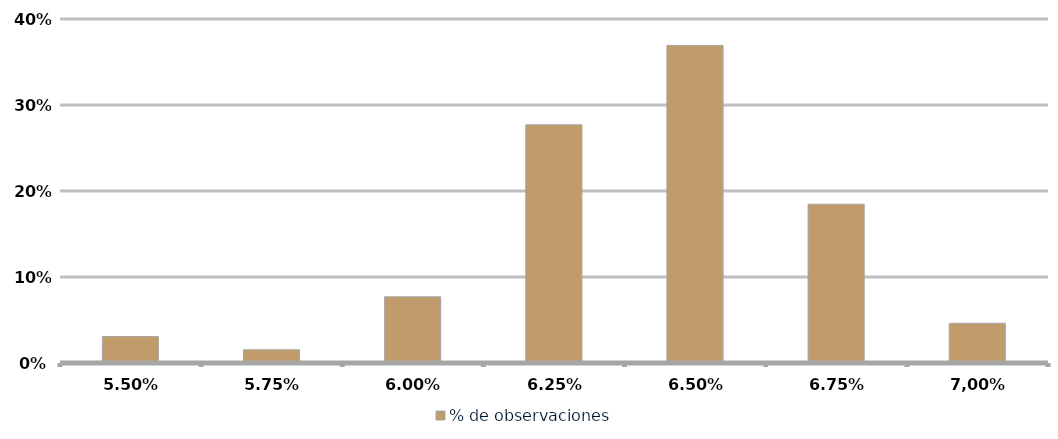
| Category | % de observaciones  |
|---|---|
| 5,50% | 0.031 |
| 5,75% | 0.015 |
| 6,00% | 0.077 |
| 6,25% | 0.277 |
| 6,50% | 0.369 |
| 6,75% | 0.185 |
| 7,00% | 0.046 |